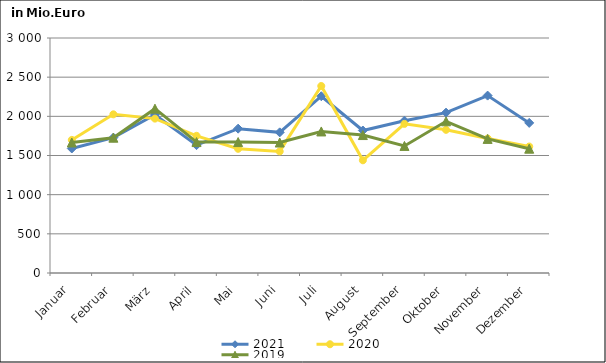
| Category | 2021 | 2020 | 2019 |
|---|---|---|---|
| Januar | 1589.705 | 1698.945 | 1666.141 |
| Februar | 1728.59 | 2025.596 | 1727.37 |
| März | 2021.022 | 1971.023 | 2097.776 |
| April | 1632.141 | 1751.111 | 1671.512 |
| Mai | 1842.708 | 1585.509 | 1671.483 |
| Juni | 1795.576 | 1552.423 | 1665.741 |
| Juli | 2256.498 | 2387.266 | 1807.037 |
| August | 1818.991 | 1438.817 | 1761.02 |
| September | 1944.01 | 1903.707 | 1622.191 |
| Oktober | 2046.976 | 1827.871 | 1936.508 |
| November | 2264.736 | 1716.501 | 1711.943 |
| Dezember | 1916.176 | 1614.257 | 1586.939 |